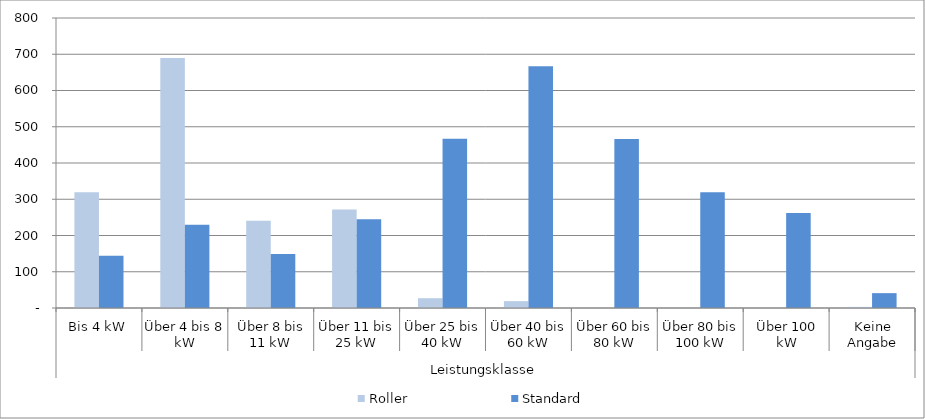
| Category | Roller | Standard |
|---|---|---|
| 0 | 319 | 144 |
| 1 | 690 | 230 |
| 2 | 241 | 149 |
| 3 | 272 | 245 |
| 4 | 27 | 467 |
| 5 | 19 | 667 |
| 6 | 0 | 466 |
| 7 | 0 | 319 |
| 8 | 0 | 262 |
| 9 | 3 | 41 |